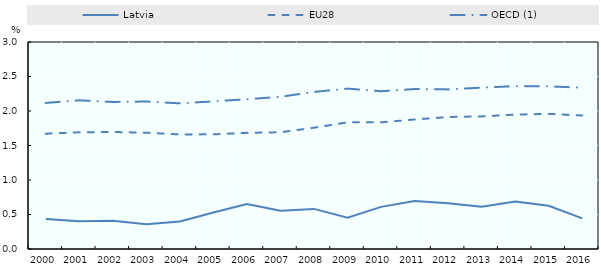
| Category | Latvia | EU28 | OECD (1) |
|---|---|---|---|
| 2000.0 | 0.436 | 1.671 | 2.117 |
| 2001.0 | 0.403 | 1.692 | 2.155 |
| 2002.0 | 0.409 | 1.696 | 2.131 |
| 2003.0 | 0.36 | 1.685 | 2.137 |
| 2004.0 | 0.4 | 1.66 | 2.111 |
| 2005.0 | 0.53 | 1.662 | 2.14 |
| 2006.0 | 0.651 | 1.684 | 2.171 |
| 2007.0 | 0.554 | 1.692 | 2.206 |
| 2008.0 | 0.581 | 1.758 | 2.277 |
| 2009.0 | 0.453 | 1.835 | 2.325 |
| 2010.0 | 0.611 | 1.836 | 2.286 |
| 2011.0 | 0.697 | 1.877 | 2.318 |
| 2012.0 | 0.664 | 1.913 | 2.313 |
| 2013.0 | 0.612 | 1.922 | 2.338 |
| 2014.0 | 0.689 | 1.948 | 2.361 |
| 2015.0 | 0.626 | 1.958 | 2.357 |
| 2016.0 | 0.443 | 1.935 | 2.337 |